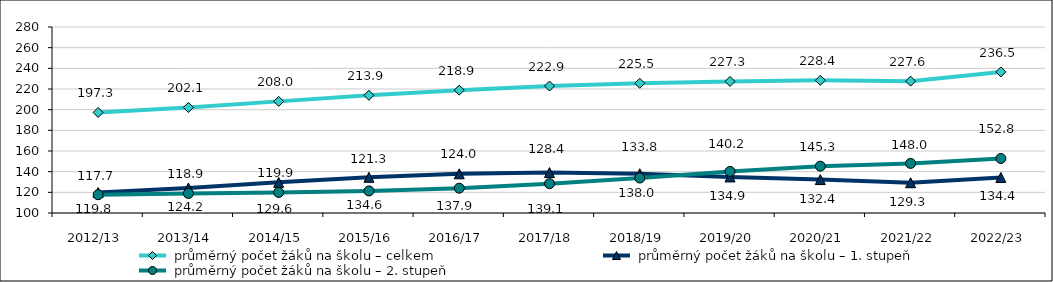
| Category |  průměrný počet žáků na školu – celkem |  průměrný počet žáků na školu – 1. stupeň |  průměrný počet žáků na školu – 2. stupeň |
|---|---|---|---|
| 2012/13 | 197.302 | 119.81 | 117.676 |
| 2013/14 | 202.113 | 124.198 | 118.917 |
| 2014/15 | 208.022 | 129.646 | 119.887 |
| 2015/16 | 213.913 | 134.56 | 121.337 |
| 2016/17 | 218.886 | 137.931 | 124.024 |
| 2017/18 | 222.89 | 139.091 | 128.402 |
| 2018/19 | 225.534 | 137.979 | 133.826 |
| 2019/20 | 227.325 | 134.901 | 140.245 |
| 2020/21 | 228.369 | 132.353 | 145.294 |
| 2021/22 | 227.601 | 129.315 | 148.007 |
| 2022/23 | 236.512 | 134.385 | 152.774 |